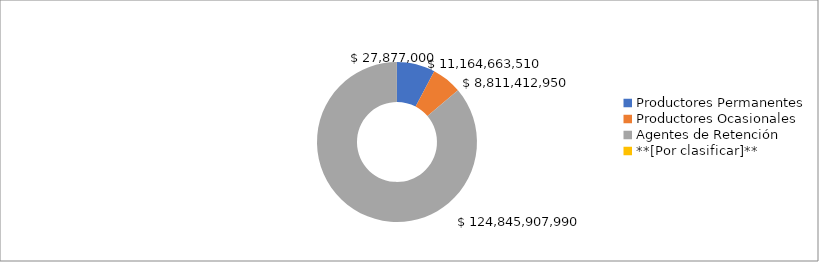
| Category | Total acumulado |
|---|---|
| Productores Permanentes | 11164663510.1 |
| Productores Ocasionales | 8811412950.4 |
| Agentes de Retención  | 124845907989.51 |
| **[Por clasificar]** | 27877000 |